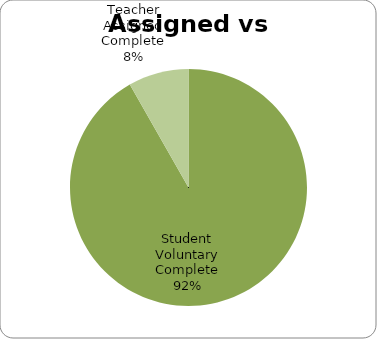
| Category | Series 0 |
|---|---|
| Student Voluntary Complete | 8288 |
| Teacher Assigned Complete | 745 |